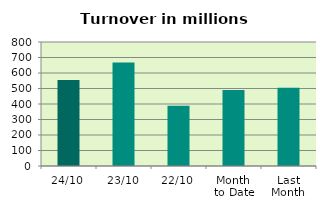
| Category | Series 0 |
|---|---|
| 24/10 | 554.663 |
| 23/10 | 667.217 |
| 22/10 | 387.996 |
| Month 
to Date | 490.27 |
| Last
Month | 505.274 |